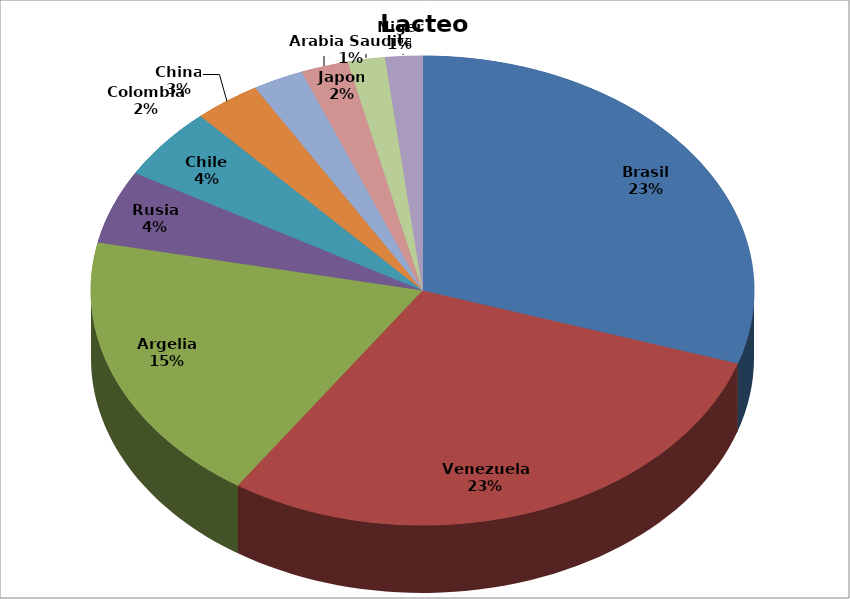
| Category | Series 0 |
|---|---|
| Brasil | 345999.812 |
| Venezuela | 338025.338 |
| Argelia | 217581.475 |
| Rusia | 58033.75 |
| Chile | 57615.179 |
| China | 37522.479 |
| Colombia | 28582.452 |
| Japon | 26642.539 |
| Arabia Saudita | 20888.69 |
| Niger | 20809.137 |